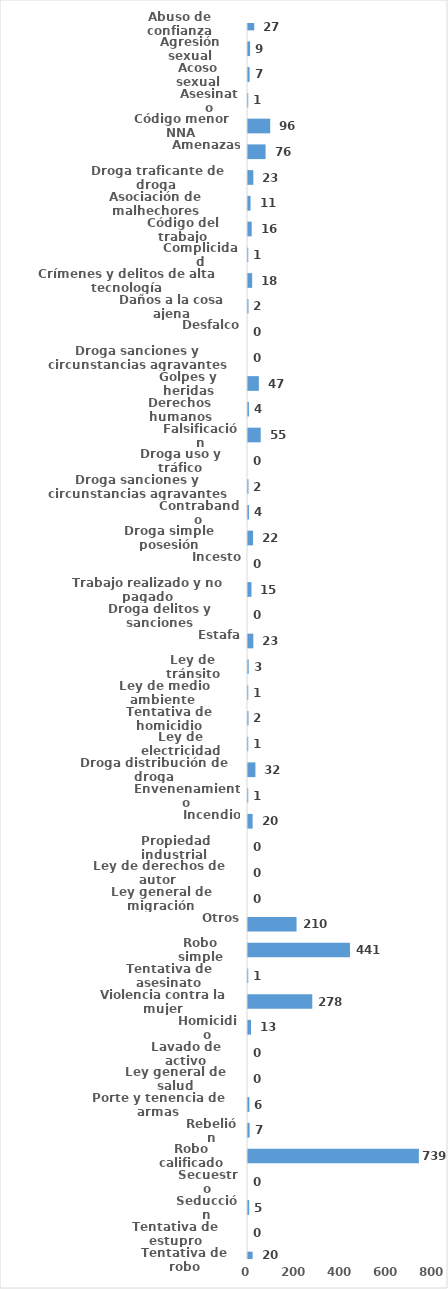
| Category | Series 0 |
|---|---|
| Abuso de confianza | 27 |
| Agresión sexual | 9 |
| Acoso sexual | 7 |
| Asesinato | 1 |
| Código menor NNA | 96 |
| Amenazas | 76 |
| Droga traficante de droga  | 23 |
| Asociación de malhechores | 11 |
| Código del trabajo | 16 |
| Complicidad | 1 |
| Crímenes y delitos de alta tecnología | 18 |
| Daños a la cosa ajena | 2 |
| Desfalco | 0 |
| Droga sanciones y circunstancias agravantes | 0 |
| Golpes y heridas | 47 |
| Derechos humanos | 4 |
| Falsificación | 55 |
| Droga uso y tráfico | 0 |
| Droga sanciones y circunstancias agravantes | 2 |
| Contrabando | 4 |
| Droga simple posesión | 22 |
| Incesto | 0 |
| Trabajo realizado y no pagado | 15 |
| Droga delitos y sanciones | 0 |
| Estafa | 23 |
| Ley de tránsito | 3 |
| Ley de medio ambiente  | 1 |
| Tentativa de homicidio | 2 |
| Ley de electricidad | 1 |
| Droga distribución de droga | 32 |
| Envenenamiento | 1 |
| Incendio | 20 |
| Propiedad industrial  | 0 |
| Ley de derechos de autor  | 0 |
| Ley general de migración | 0 |
| Otros | 210 |
| Robo simple | 441 |
| Tentativa de asesinato | 1 |
| Violencia contra la mujer | 278 |
| Homicidio | 13 |
| Lavado de activo | 0 |
| Ley general de salud | 0 |
| Porte y tenencia de armas | 6 |
| Rebelión | 7 |
| Robo calificado | 739 |
| Secuestro | 0 |
| Seducción | 5 |
| Tentativa de estupro | 0 |
| Tentativa de robo | 20 |